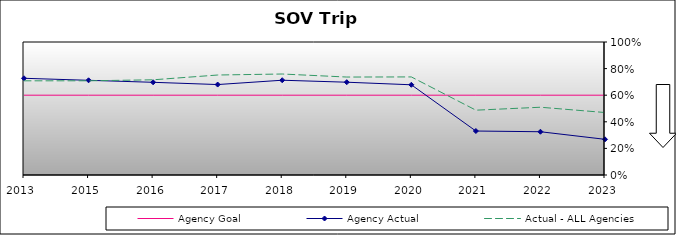
| Category | Agency Goal | Agency Actual | Actual - ALL Agencies |
|---|---|---|---|
| 2013.0 | 0.6 | 0.727 | 0.708 |
| 2015.0 | 0.6 | 0.712 | 0.708 |
| 2016.0 | 0.6 | 0.697 | 0.716 |
| 2017.0 | 0.6 | 0.68 | 0.752 |
| 2018.0 | 0.6 | 0.713 | 0.759 |
| 2019.0 | 0.6 | 0.698 | 0.736 |
| 2020.0 | 0.6 | 0.678 | 0.737 |
| 2021.0 | 0.6 | 0.331 | 0.487 |
| 2022.0 | 0.6 | 0.325 | 0.509 |
| 2023.0 | 0.6 | 0.268 | 0.47 |